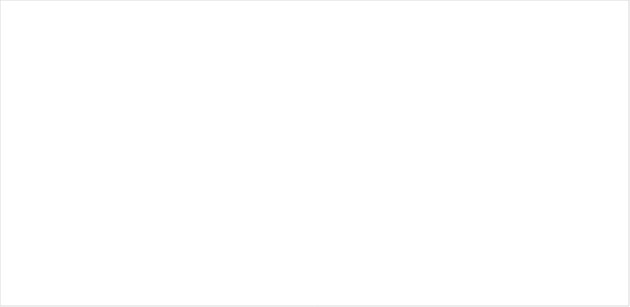
| Category | Total |
|---|---|
| N.C | 1 |
| = | 5 |
| + | 3 |